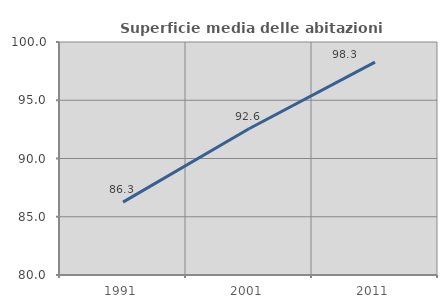
| Category | Superficie media delle abitazioni occupate |
|---|---|
| 1991.0 | 86.252 |
| 2001.0 | 92.558 |
| 2011.0 | 98.277 |